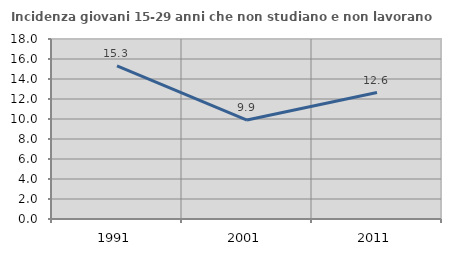
| Category | Incidenza giovani 15-29 anni che non studiano e non lavorano  |
|---|---|
| 1991.0 | 15.319 |
| 2001.0 | 9.898 |
| 2011.0 | 12.644 |